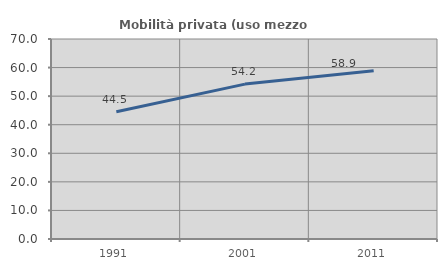
| Category | Mobilità privata (uso mezzo privato) |
|---|---|
| 1991.0 | 44.548 |
| 2001.0 | 54.213 |
| 2011.0 | 58.904 |